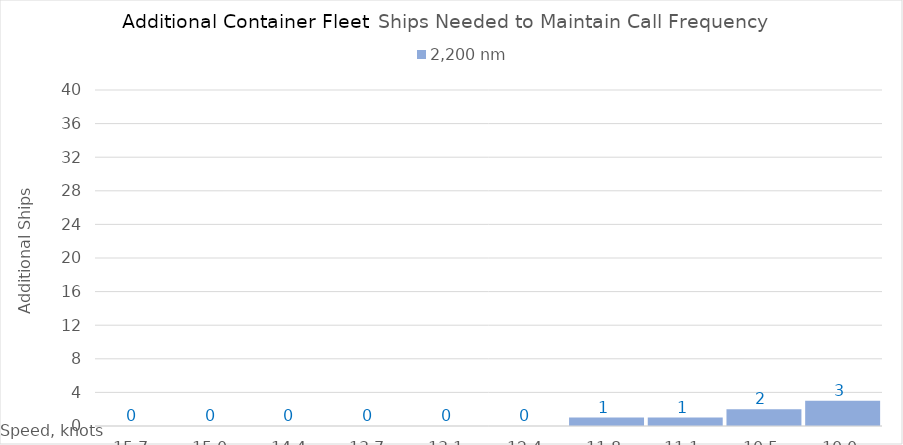
| Category | 2,200 |
|---|---|
| 15.65 | 0 |
| 15.0 | 0 |
| 14.35 | 0 |
| 13.7 | 0 |
| 13.049999999999999 | 0 |
| 12.399999999999999 | 0 |
| 11.749999999999998 | 1 |
| 11.099999999999998 | 1 |
| 10.449999999999998 | 2 |
| 10.0 | 3 |